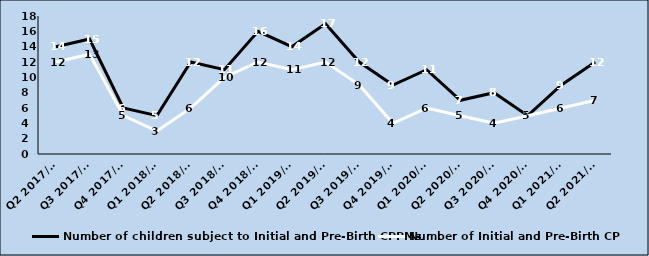
| Category | Number of children subject to Initial and Pre-Birth CPPMs | Number of Initial and Pre-Birth CPPMs |
|---|---|---|
| Q2 2017/18 | 14 | 12 |
| Q3 2017/18 | 15 | 13 |
| Q4 2017/18 | 6 | 5 |
| Q1 2018/19 | 5 | 3 |
| Q2 2018/19 | 12 | 6 |
| Q3 2018/19 | 11 | 10 |
| Q4 2018/19 | 16 | 12 |
| Q1 2019/20 | 14 | 11 |
| Q2 2019/20 | 17 | 12 |
| Q3 2019/20 | 12 | 9 |
| Q4 2019/20 | 9 | 4 |
| Q1 2020/21 | 11 | 6 |
| Q2 2020/21 | 7 | 5 |
| Q3 2020/21 | 8 | 4 |
| Q4 2020/21 | 5 | 5 |
| Q1 2021/22 | 9 | 6 |
| Q2 2021/22 | 12 | 7 |